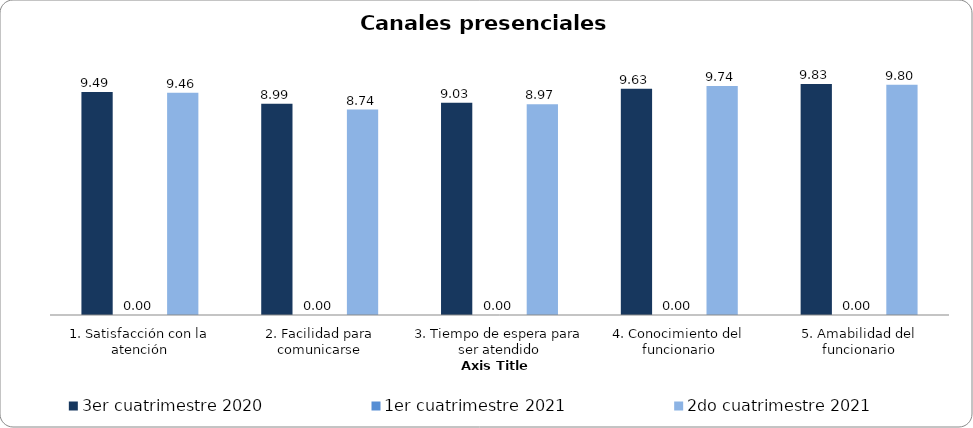
| Category | Septiembre - Octubre 2018 | Noviembre - Diciembre 2018 | 1er cuatrimestre 2019 | 2do cuatrimestre 2019 | 3er cuatrimestre 2020 | 1er cuatrimestre 2021 | 2do cuatrimestre 2021 |
|---|---|---|---|---|---|---|---|
| 1. Satisfacción con la atención |  |  |  |  | 9.488 | 0 | 9.457 |
| 2. Facilidad para comunicarse |  |  |  |  | 8.988 | 0 | 8.743 |
| 3. Tiempo de espera para ser atendido |  |  |  |  | 9.035 | 0 | 8.971 |
| 4. Conocimiento del funcionario |  |  |  |  | 9.628 | 0 | 9.743 |
| 5. Amabilidad del funcionario |  |  |  |  | 9.826 | 0 | 9.8 |